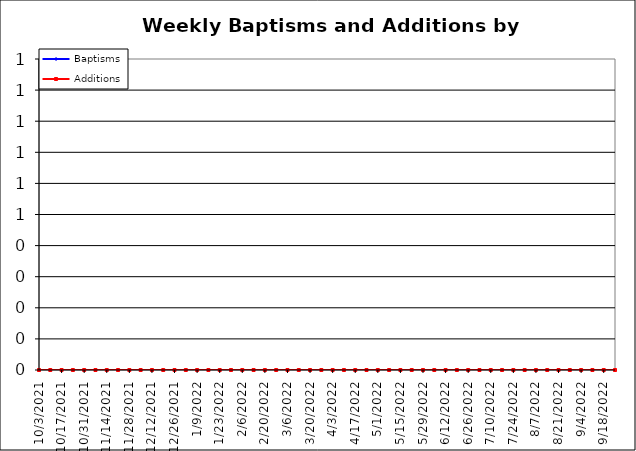
| Category | Baptisms | Additions |
|---|---|---|
| 10/3/21 | 0 | 0 |
| 10/10/21 | 0 | 0 |
| 10/17/21 | 0 | 0 |
| 10/24/21 | 0 | 0 |
| 10/31/21 | 0 | 0 |
| 11/7/21 | 0 | 0 |
| 11/14/21 | 0 | 0 |
| 11/21/21 | 0 | 0 |
| 11/28/21 | 0 | 0 |
| 12/5/21 | 0 | 0 |
| 12/12/21 | 0 | 0 |
| 12/19/21 | 0 | 0 |
| 12/26/21 | 0 | 0 |
| 1/2/22 | 0 | 0 |
| 1/9/22 | 0 | 0 |
| 1/16/22 | 0 | 0 |
| 1/23/22 | 0 | 0 |
| 1/30/22 | 0 | 0 |
| 2/6/22 | 0 | 0 |
| 2/13/22 | 0 | 0 |
| 2/20/22 | 0 | 0 |
| 2/27/22 | 0 | 0 |
| 3/6/22 | 0 | 0 |
| 3/13/22 | 0 | 0 |
| 3/20/22 | 0 | 0 |
| 3/27/22 | 0 | 0 |
| 4/3/22 | 0 | 0 |
| 4/10/22 | 0 | 0 |
| 4/17/22 | 0 | 0 |
| 4/24/22 | 0 | 0 |
| 5/1/22 | 0 | 0 |
| 5/8/22 | 0 | 0 |
| 5/15/22 | 0 | 0 |
| 5/22/22 | 0 | 0 |
| 5/29/22 | 0 | 0 |
| 6/5/22 | 0 | 0 |
| 6/12/22 | 0 | 0 |
| 6/19/22 | 0 | 0 |
| 6/26/22 | 0 | 0 |
| 7/3/22 | 0 | 0 |
| 7/10/22 | 0 | 0 |
| 7/17/22 | 0 | 0 |
| 7/24/22 | 0 | 0 |
| 7/31/22 | 0 | 0 |
| 8/7/22 | 0 | 0 |
| 8/14/22 | 0 | 0 |
| 8/21/22 | 0 | 0 |
| 8/28/22 | 0 | 0 |
| 9/4/22 | 0 | 0 |
| 9/11/22 | 0 | 0 |
| 9/18/22 | 0 | 0 |
| 9/25/22 | 0 | 0 |